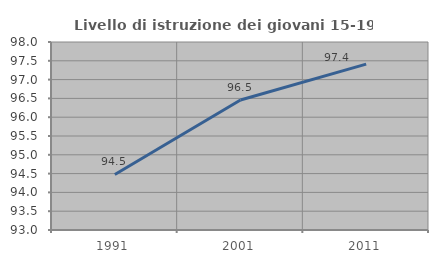
| Category | Livello di istruzione dei giovani 15-19 anni |
|---|---|
| 1991.0 | 94.477 |
| 2001.0 | 96.457 |
| 2011.0 | 97.411 |